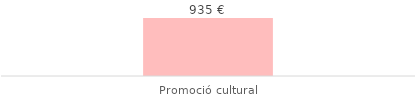
| Category | Total |
|---|---|
| Promoció cultural | 935.09 |